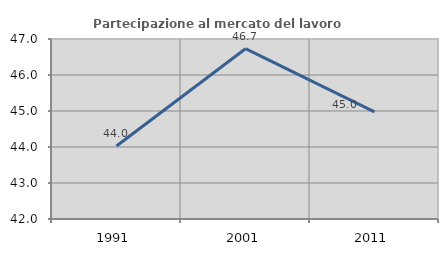
| Category | Partecipazione al mercato del lavoro  femminile |
|---|---|
| 1991.0 | 44.027 |
| 2001.0 | 46.731 |
| 2011.0 | 44.976 |